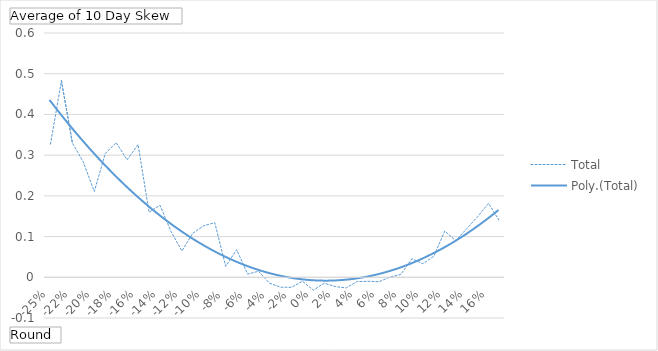
| Category | Total |
|---|---|
| -25% | 0.327 |
| -23% | 0.482 |
| -22% | 0.33 |
| -21% | 0.283 |
| -20% | 0.211 |
| -19% | 0.304 |
| -18% | 0.331 |
| -17% | 0.288 |
| -16% | 0.326 |
| -15% | 0.16 |
| -14% | 0.177 |
| -13% | 0.113 |
| -12% | 0.065 |
| -11% | 0.108 |
| -10% | 0.127 |
| -9% | 0.134 |
| -8% | 0.027 |
| -7% | 0.068 |
| -6% | 0.008 |
| -5% | 0.015 |
| -4% | -0.015 |
| -3% | -0.024 |
| -2% | -0.025 |
| -1% | -0.01 |
| 0% | -0.032 |
| 1% | -0.015 |
| 2% | -0.023 |
| 3% | -0.026 |
| 4% | -0.011 |
| 5% | -0.01 |
| 6% | -0.011 |
| 7% | 0.001 |
| 8% | 0.007 |
| 9% | 0.046 |
| 10% | 0.033 |
| 11% | 0.051 |
| 12% | 0.114 |
| 13% | 0.09 |
| 14% | 0.119 |
| 15% | 0.149 |
| 16% | 0.181 |
| 17% | 0.138 |